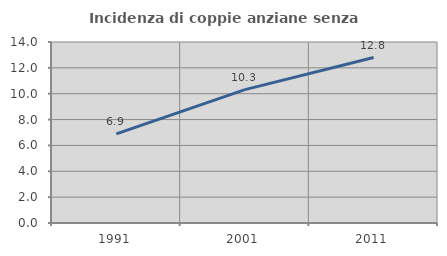
| Category | Incidenza di coppie anziane senza figli  |
|---|---|
| 1991.0 | 6.9 |
| 2001.0 | 10.314 |
| 2011.0 | 12.799 |